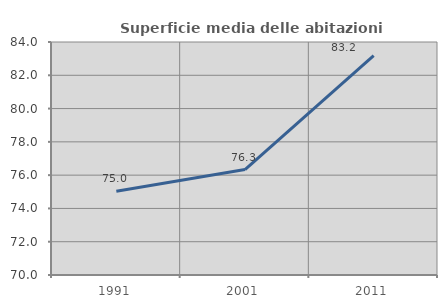
| Category | Superficie media delle abitazioni occupate |
|---|---|
| 1991.0 | 75.031 |
| 2001.0 | 76.337 |
| 2011.0 | 83.179 |